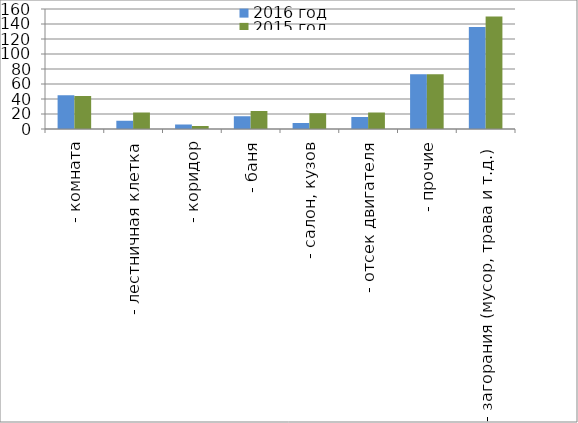
| Category | 2016 год | 2015 год |
|---|---|---|
|  - комната | 45 | 44 |
|  - лестничная клетка | 11 | 22 |
|  - коридор | 6 | 4 |
|  - баня | 17 | 24 |
|  - салон, кузов | 8 | 21 |
|  - отсек двигателя | 16 | 22 |
| - прочие | 73 | 73 |
| - загорания (мусор, трава и т.д.)  | 136 | 150 |